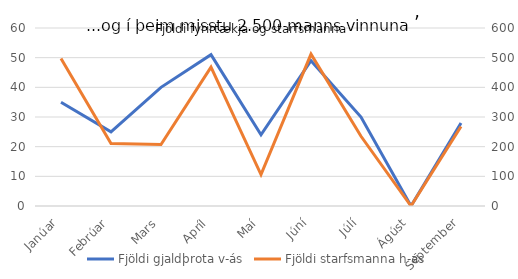
| Category | Fjöldi gjaldþrota v-ás |
|---|---|
| Janúar | 35 |
| Febrúar | 25 |
| Mars | 40 |
| Apríl | 51 |
| Maí | 24 |
| Júní | 49 |
| Júlí | 30 |
| Ágúst | 0 |
| September | 28 |